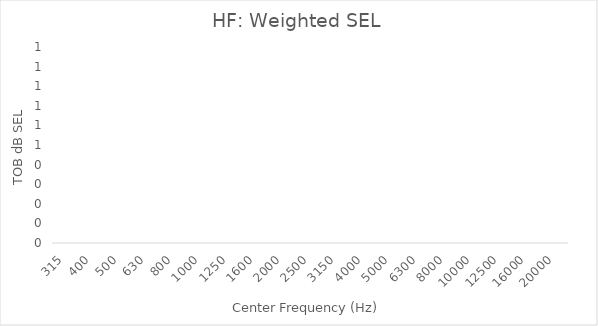
| Category | Series 0 |
|---|---|
| 315.0 | 0 |
| 400.0 | 0 |
| 500.0 | 0 |
| 630.0 | 0 |
| 800.0 | 0 |
| 1000.0 | 0 |
| 1250.0 | 0 |
| 1600.0 | 0 |
| 2000.0 | 0 |
| 2500.0 | 0 |
| 3150.0 | 0 |
| 4000.0 | 0 |
| 5000.0 | 0 |
| 6300.0 | 0 |
| 8000.0 | 0 |
| 10000.0 | 0 |
| 12500.0 | 0 |
| 16000.0 | 0 |
| 20000.0 | 0 |